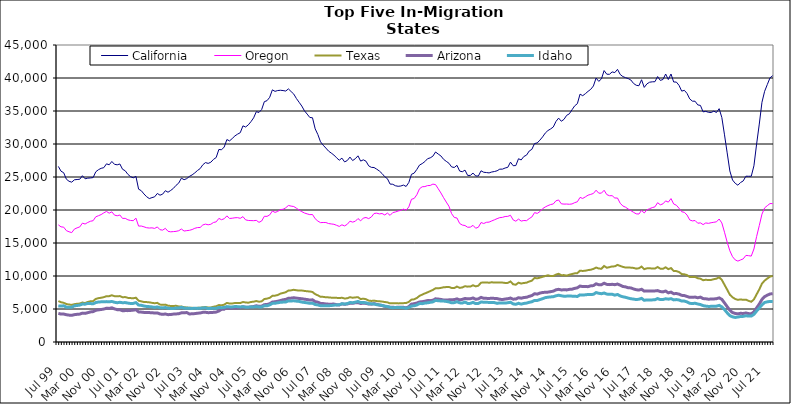
| Category | California | Oregon | Texas | Arizona | Idaho |
|---|---|---|---|---|---|
| Jul 99 | 26605 | 17749 | 6209 | 4339 | 5471 |
| Aug 99 | 25882 | 17447 | 6022 | 4228 | 5444 |
| Sep 99 | 25644 | 17401 | 5941 | 4237 | 5488 |
| Oct 99 | 24669 | 16875 | 5751 | 4134 | 5279 |
| Nov 99 | 24353 | 16701 | 5680 | 4073 | 5260 |
| Dec 99 | 24218 | 16570 | 5619 | 4042 | 5269 |
| Jan 00 | 24574 | 17109 | 5736 | 4142 | 5485 |
| Feb 00 | 24620 | 17295 | 5789 | 4192 | 5530 |
| Mar 00 | 24655 | 17436 | 5826 | 4226 | 5590 |
| Apr 00 | 25195 | 18009 | 5980 | 4375 | 5748 |
| May 00 | 24730 | 17875 | 5897 | 4337 | 5729 |
| Jun 00 | 24825 | 18113 | 6070 | 4444 | 5853 |
| Jul 00 | 24857 | 18294 | 6163 | 4555 | 5824 |
| Aug 00 | 24913 | 18376 | 6199 | 4603 | 5788 |
| Sep 00 | 25792 | 18971 | 6529 | 4804 | 5976 |
| Oct 00 | 26106 | 19135 | 6643 | 4870 | 6058 |
| Nov 00 | 26315 | 19306 | 6705 | 4926 | 6085 |
| Dec 00 | 26415 | 19570 | 6793 | 4991 | 6096 |
| Jan 01 | 26995 | 19781 | 6942 | 5122 | 6119 |
| Feb 01 | 26851 | 19519 | 6948 | 5089 | 6090 |
| Mar 01 | 27352 | 19720 | 7080 | 5180 | 6143 |
| Apr 01 | 26918 | 19221 | 6943 | 5020 | 6020 |
| May 01 | 26848 | 19126 | 6924 | 4899 | 5950 |
| Jun 01 | 26974 | 19241 | 6959 | 4895 | 6019 |
| Jul 01 | 26172 | 18725 | 6778 | 4737 | 5951 |
| Aug 01 | 25943 | 18736 | 6810 | 4757 | 5973 |
| Sep 01 | 25399 | 18514 | 6688 | 4753 | 5895 |
| Oct 01 | 25050 | 18415 | 6650 | 4780 | 5833 |
| Nov 01 | 24873 | 18381 | 6631 | 4826 | 5850 |
| Dec 01 | 25099 | 18765 | 6708 | 4898 | 5969 |
| Jan 02 | 23158 | 17561 | 6261 | 4560 | 5595 |
| Feb 02 | 22926 | 17573 | 6162 | 4531 | 5560 |
| Mar 02 | 22433 | 17452 | 6052 | 4481 | 5458 |
| Apr 02 | 22012 | 17314 | 6046 | 4458 | 5380 |
| May 02 | 21733 | 17267 | 6007 | 4452 | 5358 |
| Jun 02 | 21876 | 17298 | 5933 | 4444 | 5315 |
| Jul 02 | 21997 | 17209 | 5873 | 4383 | 5243 |
| Aug 02 | 22507 | 17436 | 5929 | 4407 | 5315 |
| Sep 02 | 22244 | 17010 | 5672 | 4248 | 5192 |
| Oct 02 | 22406 | 16952 | 5625 | 4191 | 5167 |
| Nov 02 | 22922 | 17223 | 5663 | 4242 | 5221 |
| Dec 02 | 22693 | 16770 | 5499 | 4142 | 5120 |
| Jan 03 | 22964 | 16694 | 5463 | 4166 | 5089 |
| Feb 03 | 23276 | 16727 | 5461 | 4226 | 5077 |
| Mar 03 | 23736 | 16766 | 5486 | 4251 | 5145 |
| Apr 03 | 24079 | 16859 | 5389 | 4289 | 5145 |
| May 03 | 24821 | 17117 | 5378 | 4415 | 5254 |
| Jun 03 | 24592 | 16812 | 5273 | 4426 | 5135 |
| Jul 03 | 24754 | 16875 | 5226 | 4466 | 5124 |
| Aug 03 | 25092 | 16922 | 5181 | 4244 | 5100 |
| Sep 03 | 25316 | 17036 | 5181 | 4279 | 5086 |
| Oct 03 | 25622 | 17228 | 5139 | 4301 | 5110 |
| Nov 03 | 25984 | 17335 | 5175 | 4362 | 5091 |
| Dec 03 | 26269 | 17350 | 5189 | 4396 | 5113 |
| Jan 04 | 26852 | 17734 | 5255 | 4492 | 5152 |
| Feb 04 | 27184 | 17860 | 5301 | 4502 | 5183 |
| Mar 04 | 27062 | 17757 | 5227 | 4443 | 5056 |
| Apr 04 | 27238 | 17840 | 5227 | 4461 | 5104 |
| May 04 | 27671 | 18113 | 5345 | 4493 | 5095 |
| Jun 04 | 27949 | 18201 | 5416 | 4532 | 5103 |
| Jul 04 | 29172 | 18727 | 5597 | 4697 | 5231 |
| Aug 04 | 29122 | 18529 | 5561 | 4945 | 5197 |
| Sep 04 | 29542 | 18678 | 5656 | 4976 | 5237 |
| Oct 04 | 30674 | 19108 | 5922 | 5188 | 5363 |
| Nov 04 | 30472 | 18716 | 5823 | 5106 | 5321 |
| Dec 04 | 30831 | 18755 | 5838 | 5135 | 5312 |
| Jan 05 | 31224 | 18823 | 5906 | 5155 | 5374 |
| Feb 05 | 31495 | 18842 | 5898 | 5168 | 5357 |
| Mar 05 | 31714 | 18738 | 5894 | 5212 | 5313 |
| Apr 05 | 32750 | 18998 | 6060 | 5340 | 5350 |
| May 05 | 32575 | 18504 | 5989 | 5269 | 5276 |
| Jun 05 | 32898 | 18414 | 5954 | 5252 | 5271 |
| Jul 05 | 33384 | 18395 | 6062 | 5322 | 5322 |
| Aug 05 | 33964 | 18381 | 6113 | 5375 | 5316 |
| Sep 05 | 34897 | 18426 | 6206 | 5493 | 5362 |
| Oct 05 | 34780 | 18132 | 6100 | 5408 | 5308 |
| Nov 05 | 35223 | 18332 | 6162 | 5434 | 5314 |
| Dec 05 | 36415 | 19047 | 6508 | 5658 | 5487 |
| Jan 06 | 36567 | 19032 | 6576 | 5688 | 5480 |
| Feb 06 | 37074 | 19257 | 6692 | 5792 | 5616 |
| Mar 06 | 38207 | 19845 | 6993 | 6052 | 5850 |
| Apr 06 | 37976 | 19637 | 7024 | 6101 | 5864 |
| May 06 | 38099 | 19781 | 7114 | 6178 | 5943 |
| Jun 06 | 38141 | 20061 | 7331 | 6276 | 6018 |
| Jul 06 | 38097 | 20111 | 7431 | 6399 | 6046 |
| Aug 06 | 38021 | 20333 | 7542 | 6450 | 6064 |
| Sep 06 | 38349 | 20686 | 7798 | 6627 | 6232 |
| Oct 06 | 37947 | 20591 | 7825 | 6647 | 6216 |
| Nov 06 | 37565 | 20526 | 7907 | 6707 | 6244 |
| Dec 06 | 36884 | 20272 | 7840 | 6648 | 6192 |
| Jan 07 | 36321 | 19984 | 7789 | 6597 | 6151 |
| Feb 07 | 35752 | 19752 | 7799 | 6554 | 6048 |
| Mar 07 | 35025 | 19547 | 7737 | 6487 | 5989 |
| Apr 07 | 34534 | 19412 | 7685 | 6430 | 5937 |
| May 07 | 34022 | 19296 | 7654 | 6353 | 5858 |
| Jun 07 | 33974 | 19318 | 7577 | 6390 | 5886 |
| Jul 07 | 32298 | 18677 | 7250 | 6117 | 5682 |
| Aug 07 | 31436 | 18322 | 7070 | 6034 | 5617 |
| Sep 07 | 30331 | 18087 | 6853 | 5847 | 5500 |
| Oct 07 | 29813 | 18108 | 6839 | 5821 | 5489 |
| Nov 07 | 29384 | 18105 | 6777 | 5769 | 5481 |
| Dec 07 | 28923 | 17949 | 6760 | 5733 | 5499 |
| Jan 08 | 28627 | 17890 | 6721 | 5732 | 5521 |
| Feb 08 | 28328 | 17834 | 6719 | 5749 | 5579 |
| Mar 08 | 27911 | 17680 | 6690 | 5650 | 5614 |
| Apr 08 | 27543 | 17512 | 6656 | 5612 | 5635 |
| May 08 | 27856 | 17754 | 6705 | 5774 | 5798 |
| Jun 08 | 27287 | 17589 | 6593 | 5717 | 5745 |
| Jul 08 | 27495 | 17834 | 6623 | 5761 | 5807 |
| Aug 08 | 28018 | 18309 | 6789 | 5867 | 5982 |
| Sep-08 | 27491 | 18164 | 6708 | 5864 | 5954 |
| Oct 08 | 27771 | 18291 | 6755 | 5942 | 6032 |
| Nov 08 | 28206 | 18706 | 6787 | 5970 | 6150 |
| Dec 08 | 27408 | 18353 | 6505 | 5832 | 5975 |
| Jan 09 | 27601 | 18778 | 6569 | 5890 | 5995 |
| Feb 09 | 27394 | 18863 | 6483 | 5845 | 5936 |
| Mar 09 | 26690 | 18694 | 6273 | 5751 | 5806 |
| Apr 09 | 26461 | 18943 | 6222 | 5735 | 5777 |
| May 09 | 26435 | 19470 | 6272 | 5819 | 5767 |
| Jun 09 | 26187 | 19522 | 6199 | 5700 | 5649 |
| Jul 09 | 25906 | 19408 | 6171 | 5603 | 5617 |
| Aug 09 | 25525 | 19469 | 6128 | 5533 | 5540 |
| Sep 09 | 25050 | 19249 | 6059 | 5405 | 5437 |
| Oct 09 | 24741 | 19529 | 6004 | 5349 | 5369 |
| Nov 09 | 23928 | 19187 | 5854 | 5271 | 5248 |
| Dec 09 | 23899 | 19607 | 5886 | 5261 | 5195 |
| Jan 10 | 23676 | 19703 | 5881 | 5232 | 5234 |
| Feb 10 | 23592 | 19845 | 5850 | 5272 | 5236 |
| Mar 10 | 23634 | 19946 | 5864 | 5278 | 5219 |
| Apr 10 | 23774 | 20134 | 5889 | 5257 | 5201 |
| May 10 | 23567 | 19966 | 5897 | 5172 | 5105 |
| Jun 10 | 24166 | 20464 | 6087 | 5356 | 5237 |
| Jul 10 | 25410 | 21627 | 6417 | 5742 | 5452 |
| Aug 10 | 25586 | 21744 | 6465 | 5797 | 5491 |
| Sep 10 | 26150 | 22314 | 6667 | 5907 | 5609 |
| Oct 10 | 26807 | 23219 | 6986 | 6070 | 5831 |
| Nov 10 | 27033 | 23520 | 7179 | 6100 | 5810 |
| Dec 10 | 27332 | 23551 | 7361 | 6182 | 5898 |
| Jan 11 | 27769 | 23697 | 7525 | 6276 | 5938 |
| Feb 11 | 27898 | 23718 | 7708 | 6267 | 6016 |
| Mar 11 | 28155 | 23921 | 7890 | 6330 | 6081 |
| Apr 11 | 28790 | 23847 | 8146 | 6544 | 6305 |
| May 11 | 28471 | 23215 | 8131 | 6502 | 6248 |
| Jun 11 | 28191 | 22580 | 8199 | 6445 | 6217 |
| Jul 11 | 27678 | 21867 | 8291 | 6368 | 6202 |
| Aug 11 | 27372 | 21203 | 8321 | 6356 | 6146 |
| Sep 11 | 27082 | 20570 | 8341 | 6387 | 6075 |
| Oct 11 | 26528 | 19442 | 8191 | 6402 | 5932 |
| Nov 11 | 26440 | 18872 | 8176 | 6426 | 5968 |
| Dec 11 | 26770 | 18784 | 8401 | 6533 | 6106 |
| Jan 12 | 25901 | 17963 | 8202 | 6390 | 5933 |
| Feb 12 | 25796 | 17718 | 8266 | 6456 | 5900 |
| Mar 12 | 26042 | 17647 | 8456 | 6600 | 6054 |
| Apr 12 | 25239 | 17386 | 8388 | 6534 | 5838 |
| May 12 | 25238 | 17407 | 8401 | 6558 | 5854 |
| Jun 12 | 25593 | 17673 | 8594 | 6669 | 6009 |
| Jul 12 | 25155 | 17237 | 8432 | 6474 | 5817 |
| Aug 12 | 25146 | 17391 | 8536 | 6539 | 5842 |
| Sep 12 | 25942 | 18102 | 8989 | 6759 | 6061 |
| Oct 12 | 25718 | 17953 | 9012 | 6618 | 6027 |
| Nov 12 | 25677 | 18134 | 9032 | 6611 | 6009 |
| Dec 12 | 25619 | 18166 | 8981 | 6601 | 5999 |
| Jan 13 | 25757 | 18344 | 9051 | 6627 | 5989 |
| Feb-13 | 25830 | 18512 | 9001 | 6606 | 5968 |
| Mar-13 | 25940 | 18689 | 9021 | 6577 | 5853 |
| Apr 13 | 26187 | 18844 | 9013 | 6478 | 5925 |
| May 13 | 26192 | 18884 | 9003 | 6431 | 5924 |
| Jun-13 | 26362 | 19013 | 8948 | 6508 | 5896 |
| Jul 13 | 26467 | 19037 | 8958 | 6559 | 5948 |
| Aug 13 | 27253 | 19198 | 9174 | 6655 | 6020 |
| Sep 13 | 26711 | 18501 | 8747 | 6489 | 5775 |
| Oct 13 | 26733 | 18301 | 8681 | 6511 | 5711 |
| Nov 13 | 27767 | 18620 | 8989 | 6709 | 5860 |
| Dec 13 | 27583 | 18320 | 8863 | 6637 | 5740 |
| Jan 14 | 28107 | 18409 | 8939 | 6735 | 5843 |
| Feb-14 | 28313 | 18383 | 8989 | 6779 | 5893 |
| Mar 14 | 28934 | 18696 | 9160 | 6918 | 6015 |
| Apr 14 | 29192 | 18946 | 9291 | 7036 | 6099 |
| May 14 | 30069 | 19603 | 9701 | 7314 | 6304 |
| Jun 14 | 30163 | 19487 | 9641 | 7252 | 6293 |
| Jul-14 | 30587 | 19754 | 9752 | 7415 | 6427 |
| Aug-14 | 31074 | 20201 | 9882 | 7499 | 6557 |
| Sep 14 | 31656 | 20459 | 9997 | 7536 | 6719 |
| Oct 14 | 32037 | 20663 | 10109 | 7555 | 6786 |
| Nov 14 | 32278 | 20825 | 9992 | 7628 | 6831 |
| Dec 14 | 32578 | 20918 | 10006 | 7705 | 6860 |
| Jan 15 | 33414 | 21396 | 10213 | 7906 | 7000 |
| Feb 15 | 33922 | 21518 | 10337 | 7982 | 7083 |
| Mar 15 | 33447 | 20942 | 10122 | 7891 | 7006 |
| Apr-15 | 33731 | 20893 | 10138 | 7906 | 6931 |
| May 15 | 34343 | 20902 | 10053 | 7895 | 6952 |
| Jun-15 | 34572 | 20870 | 10192 | 7973 | 6966 |
| Jul 15 | 35185 | 20916 | 10303 | 8000 | 6949 |
| Aug 15 | 35780 | 21115 | 10399 | 8126 | 6938 |
| Sep 15 | 36109 | 21246 | 10428 | 8207 | 6896 |
| Oct 15 | 37555 | 21908 | 10813 | 8477 | 7140 |
| Nov 15 | 37319 | 21750 | 10763 | 8390 | 7112 |
| Dec 15 | 37624 | 21990 | 10807 | 8395 | 7149 |
| Jan 16 | 37978 | 22248 | 10892 | 8388 | 7201 |
| Feb 16 | 38285 | 22369 | 10951 | 8508 | 7192 |
| Mar 16 | 38792 | 22506 | 11075 | 8547 | 7226 |
| Apr 16 | 39994 | 22999 | 11286 | 8815 | 7487 |
| May 16 | 39488 | 22548 | 11132 | 8673 | 7382 |
| Jun 16 | 39864 | 22556 | 11100 | 8682 | 7315 |
| Jul 16 | 41123 | 22989 | 11516 | 8903 | 7420 |
| Aug 16 | 40573 | 22333 | 11251 | 8731 | 7261 |
| Sep 16 | 40560 | 22162 | 11340 | 8692 | 7216 |
| Oct 16 | 40923 | 22172 | 11456 | 8742 | 7233 |
| Nov 16 | 40817 | 21818 | 11459 | 8685 | 7101 |
| Dec 16 | 41311 | 21815 | 11681 | 8783 | 7203 |
| Jan 17 | 40543 | 21029 | 11524 | 8609 | 6982 |
| Feb 17 | 40218 | 20613 | 11385 | 8416 | 6852 |
| Mar 17 | 40052 | 20425 | 11276 | 8354 | 6775 |
| Apr 17 | 39913 | 20147 | 11297 | 8218 | 6653 |
| May 17 | 39695 | 19910 | 11265 | 8196 | 6552 |
| Jun 17 | 39177 | 19650 | 11225 | 8034 | 6500 |
| Jul 17 | 38901 | 19419 | 11115 | 7923 | 6429 |
| Aug 17 | 38827 | 19389 | 11168 | 7867 | 6479 |
| Sep 17 | 39736 | 19936 | 11426 | 7991 | 6609 |
| Oct 17 | 38576 | 19547 | 11041 | 7708 | 6315 |
| Nov 17 | 39108 | 20013 | 11158 | 7746 | 6381 |
| Dec 17 | 39359 | 20202 | 11185 | 7743 | 6366 |
| Jan 18 | 39420 | 20362 | 11118 | 7736 | 6380 |
| Feb 18 | 39440 | 20476 | 11128 | 7741 | 6407 |
| Mar 18 | 40218 | 21106 | 11362 | 7789 | 6578 |
| Apr 18 | 39637 | 20788 | 11111 | 7642 | 6423 |
| May 18 | 39777 | 20933 | 11097 | 7591 | 6430 |
| Jun 18 | 40602 | 21381 | 11317 | 7721 | 6554 |
| Jul 18 | 39767 | 21189 | 11038 | 7445 | 6489 |
| Aug 18 | 40608 | 21729 | 11200 | 7560 | 6569 |
| Sep 18 | 39395 | 20916 | 10772 | 7318 | 6383 |
| Oct 18 | 39383 | 20724 | 10740 | 7344 | 6429 |
| Nov 18 | 38891 | 20265 | 10605 | 7255 | 6365 |
| Dec 18 | 38013 | 19741 | 10292 | 7069 | 6205 |
| Jan 19 | 38130 | 19643 | 10261 | 7032 | 6203 |
| Feb 19 | 37658 | 19237 | 10132 | 6892 | 6073 |
| Mar 19 | 36831 | 18492 | 9848 | 6766 | 5863 |
| Apr 19 | 36492 | 18349 | 9839 | 6763 | 5827 |
| May 19 | 36481 | 18407 | 9867 | 6809 | 5873 |
| Jun 19 | 35925 | 17998 | 9661 | 6698 | 5761 |
| Jul 19 | 35843 | 18049 | 9598 | 6800 | 5673 |
| Aug 19 | 34870 | 17785 | 9361 | 6577 | 5512 |
| Sep 19 | 34945 | 18038 | 9428 | 6547 | 5437 |
| Oct 19 | 34802 | 17977 | 9385 | 6483 | 5390 |
| Nov 19 | 34775 | 18072 | 9403 | 6511 | 5401 |
| Dec 19 | 34976 | 18140 | 9518 | 6521 | 5419 |
| Jan 20 | 34774 | 18209 | 9594 | 6561 | 5434 |
| Feb 20 | 35352 | 18632 | 9804 | 6682 | 5543 |
| Mar 20 | 34013 | 18041 | 9411 | 6464 | 5330 |
| Apr 20 | 31385 | 16629 | 8666 | 5922 | 4906 |
| May 20 | 28657 | 15123 | 7927 | 5355 | 4419 |
| Jun 20 | 25915 | 13817 | 7164 | 4815 | 3992 |
| Jul 20 | 24545 | 12926 | 6776 | 4457 | 3810 |
| Aug 20 | 24048 | 12443 | 6521 | 4326 | 3720 |
| Sep 20 | 23756 | 12258 | 6386 | 4266 | 3784 |
| Oct 20 | 24166 | 12429 | 6452 | 4347 | 3861 |
| Nov 20 | 24404 | 12597 | 6386 | 4324 | 3883 |
| Dec 20 | 25120 | 13122 | 6420 | 4394 | 3974 |
| Jan 21 | 25111 | 13080 | 6236 | 4304 | 3924 |
| Feb 21 | 25114 | 13015 | 6094 | 4260 | 3930 |
| Mar 21 | 26701 | 14096 | 6455 | 4567 | 4185 |
| Apr 21 | 29998 | 15978 | 7222 | 5164 | 4697 |
| May 21 | 33020 | 17641 | 7969 | 5748 | 5148 |
| Jun 21 | 36320 | 19369 | 8840 | 6450 | 5628 |
| Jul 21 | 37989 | 20320 | 9306 | 6877 | 5984 |
| Aug 21 | 39007 | 20657 | 9615 | 7094 | 6084 |
| Sep 21 | 40023 | 20974 | 9914 | 7277 | 6151 |
| Oct 21 | 40348 | 20966 | 10003 | 7327 | 6140 |